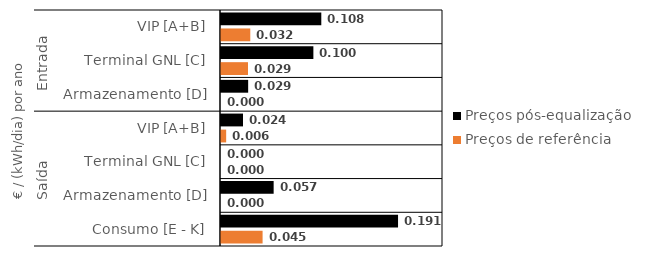
| Category | Preços pós-equalização | Preços de referência |
|---|---|---|
| 0 | 0.108 | 0.032 |
| 1 | 0.1 | 0.029 |
| 2 | 0.029 | 0 |
| 3 | 0.024 | 0.006 |
| 4 | 0 | 0 |
| 5 | 0.057 | 0 |
| 6 | 0.191 | 0.045 |